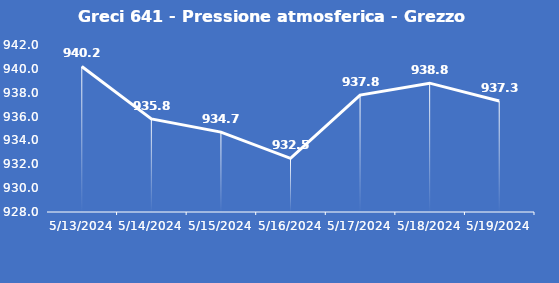
| Category | Greci 641 - Pressione atmosferica - Grezzo (hPa) |
|---|---|
| 5/13/24 | 940.2 |
| 5/14/24 | 935.8 |
| 5/15/24 | 934.7 |
| 5/16/24 | 932.5 |
| 5/17/24 | 937.8 |
| 5/18/24 | 938.8 |
| 5/19/24 | 937.3 |